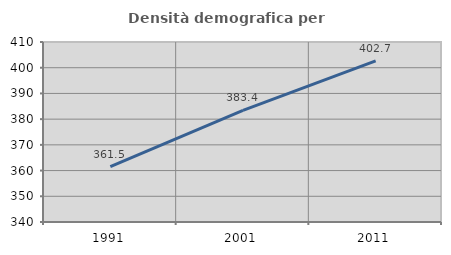
| Category | Densità demografica |
|---|---|
| 1991.0 | 361.533 |
| 2001.0 | 383.398 |
| 2011.0 | 402.655 |